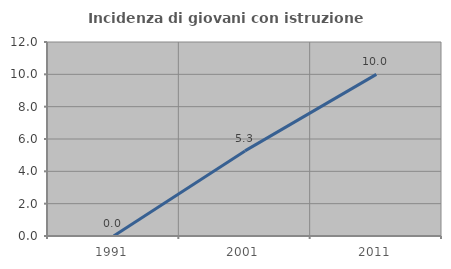
| Category | Incidenza di giovani con istruzione universitaria |
|---|---|
| 1991.0 | 0 |
| 2001.0 | 5.263 |
| 2011.0 | 10 |